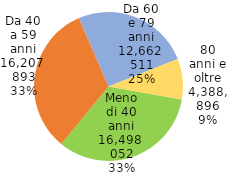
| Category | Series 0 |
|---|---|
| Meno di 40 anni | 16498052 |
| Da 40 a 59 anni | 16207893 |
| Da 60 e 79 anni | 12662511 |
| 80 anni e oltre | 4388896 |